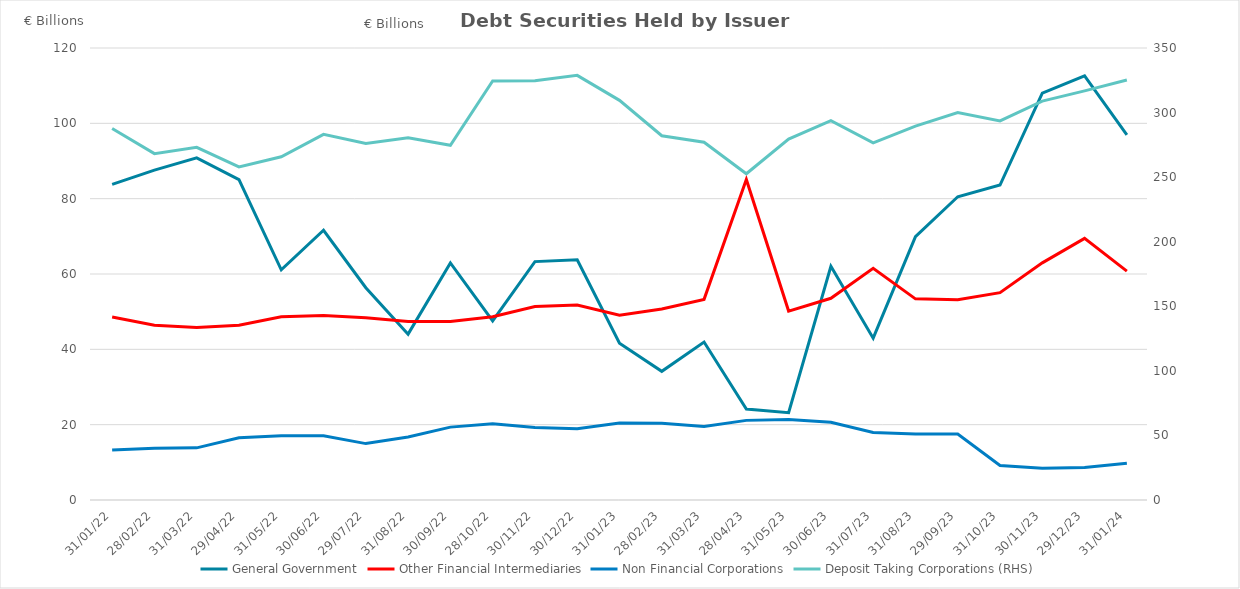
| Category | General Government | Other Financial Intermediaries | Non Financial Corporations |
|---|---|---|---|
| 2022-01-31 | 83.795 | 48.578 | 13.243 |
| 2022-02-28 | 87.582 | 46.39 | 13.771 |
| 2022-03-31 | 90.84 | 45.781 | 13.841 |
| 2022-04-29 | 85.033 | 46.398 | 16.497 |
| 2022-05-31 | 61.12 | 48.621 | 17.055 |
| 2022-06-30 | 71.613 | 48.983 | 17.08 |
| 2022-07-29 | 56.366 | 48.41 | 14.973 |
| 2022-08-31 | 44.033 | 47.374 | 16.747 |
| 2022-09-30 | 62.942 | 47.368 | 19.35 |
| 2022-10-28 | 47.526 | 48.643 | 20.217 |
| 2022-11-30 | 63.288 | 51.388 | 19.222 |
| 2022-12-30 | 63.785 | 51.765 | 18.912 |
| 2023-01-31 | 41.639 | 49.074 | 20.453 |
| 2023-02-28 | 34.164 | 50.702 | 20.392 |
| 2023-03-31 | 41.933 | 53.268 | 19.501 |
| 2023-04-28 | 24.128 | 85.071 | 21.14 |
| 2023-05-31 | 23.19 | 50.155 | 21.391 |
| 2023-06-30 | 62.05 | 53.548 | 20.652 |
| 2023-07-31 | 42.972 | 61.521 | 17.919 |
| 2023-08-31 | 69.911 | 53.397 | 17.544 |
| 2023-09-29 | 80.515 | 53.164 | 17.541 |
| 2023-10-31 | 83.624 | 55.054 | 9.176 |
| 2023-11-30 | 108.02 | 62.96 | 8.423 |
| 2023-12-29 | 112.617 | 69.449 | 8.623 |
| 2024-01-31 | 96.967 | 60.761 | 9.746 |